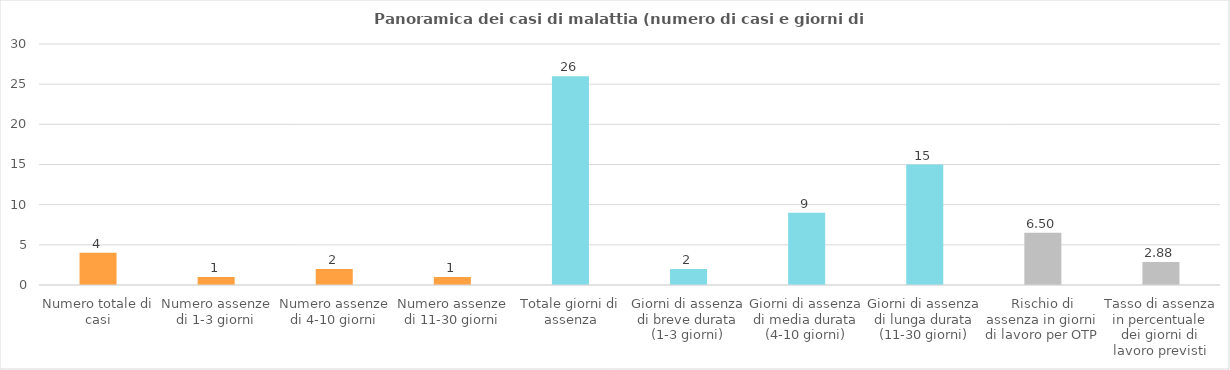
| Category | Malattia  |
|---|---|
| Numero totale di casi | 4 |
| Numero assenze di 1-3 giorni | 1 |
| Numero assenze di 4-10 giorni | 2 |
| Numero assenze di 11-30 giorni | 1 |
| Totale giorni di assenza | 26 |
| Giorni di assenza di breve durata (1-3 giorni) | 2 |
| Giorni di assenza di media durata (4-10 giorni) | 9 |
| Giorni di assenza di lunga durata (11-30 giorni) | 15 |
| Rischio di assenza in giorni di lavoro per OTP | 6.5 |
| Tasso di assenza in percentuale dei giorni di lavoro previsti | 2.876 |